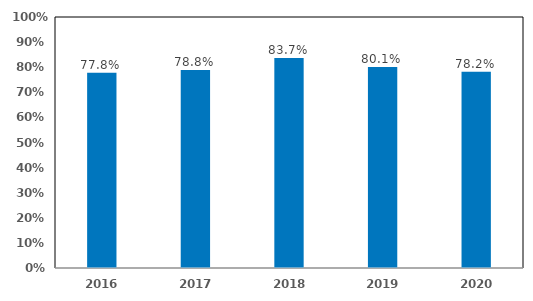
| Category | Percent of Gen in WA and/or Connected |
|---|---|
| 2016.0 | 0.778 |
| 2017.0 | 0.788 |
| 2018.0 | 0.837 |
| 2019.0 | 0.801 |
| 2020.0 | 0.782 |